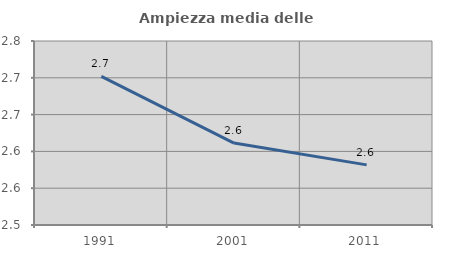
| Category | Ampiezza media delle famiglie |
|---|---|
| 1991.0 | 2.702 |
| 2001.0 | 2.611 |
| 2011.0 | 2.582 |